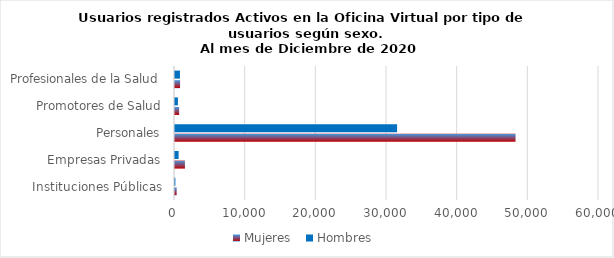
| Category | Mujeres | Hombres |
|---|---|---|
| Instituciones Públicas | 236 | 54 |
| Empresas Privadas | 1405 | 510 |
| Personales | 48189 | 31429 |
| Promotores de Salud | 585 | 410 |
| Profesionales de la Salud | 717 | 700 |